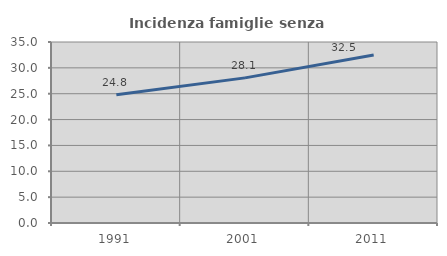
| Category | Incidenza famiglie senza nuclei |
|---|---|
| 1991.0 | 24.782 |
| 2001.0 | 28.062 |
| 2011.0 | 32.5 |